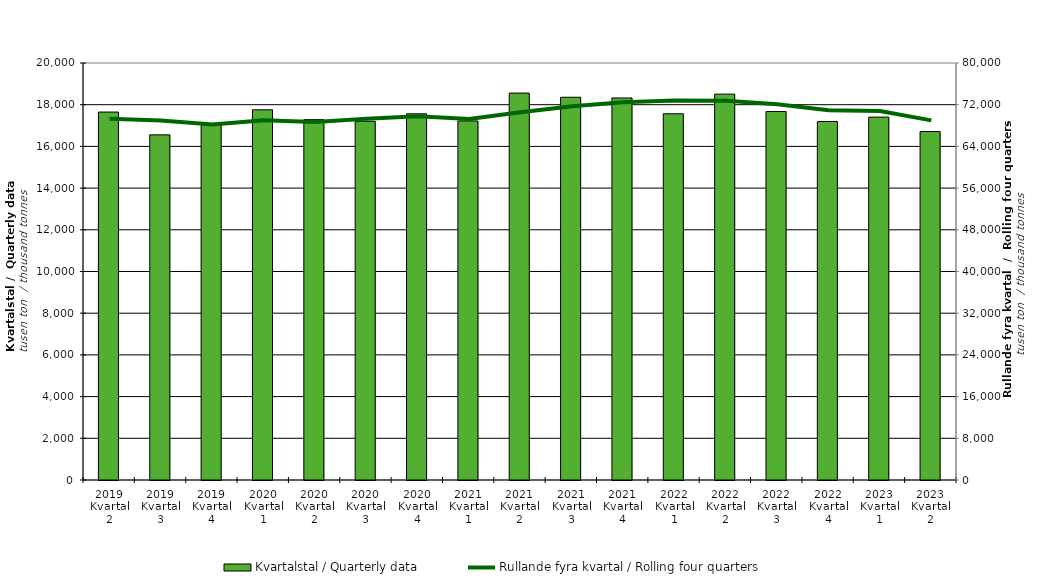
| Category | Kvartalstal / Quarterly data |
|---|---|
| 2019 Kvartal 2 | 17647.493 |
| 2019 Kvartal 3 | 16553.159 |
| 2019 Kvartal 4 | 17080.691 |
| 2020 Kvartal 1 | 17755.324 |
| 2020 Kvartal 2 | 17283.081 |
| 2020 Kvartal 3 | 17203.185 |
| 2020 Kvartal 4 | 17563.403 |
| 2021 Kvartal 1 | 17221.505 |
| 2021 Kvartal 2 | 18556.292 |
| 2021 Kvartal 3 | 18357.009 |
| 2021 Kvartal 4 | 18323.49 |
| 2022 Kvartal 1 | 17565.59 |
| 2022 Kvartal 2 | 18506.797 |
| 2022 Kvartal 3 | 17673.481 |
| 2022 Kvartal 4 | 17195.877 |
| 2023 Kvartal 1 | 17405.178 |
| 2023 Kvartal 2 | 16712.409 |